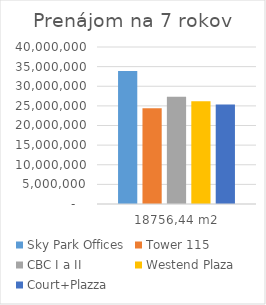
| Category | Sky Park Offices | Tower 115 | CBC I a II | Westend Plaza | Court+Plazza |
|---|---|---|---|---|---|
| 18756,44 m2 | 33898248.72 | 24369339.994 | 27337032.408 | 26196827.832 | 25340027.832 |